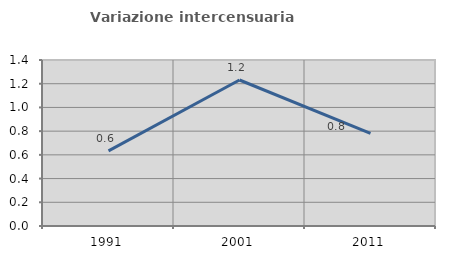
| Category | Variazione intercensuaria annua |
|---|---|
| 1991.0 | 0.633 |
| 2001.0 | 1.231 |
| 2011.0 | 0.78 |